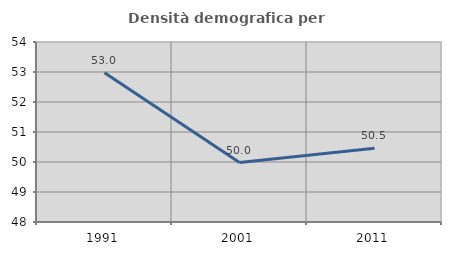
| Category | Densità demografica |
|---|---|
| 1991.0 | 52.975 |
| 2001.0 | 49.98 |
| 2011.0 | 50.461 |